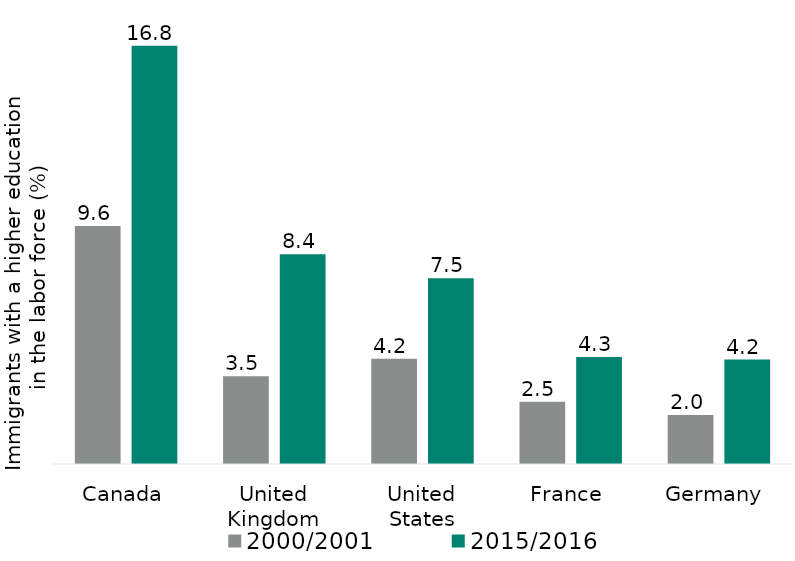
| Category | 2000/2001 | 2015/2016 |
|---|---|---|
| Canada | 9.563 | 16.808 |
| United Kingdom | 3.527 | 8.423 |
| United States | 4.234 | 7.461 |
| France | 2.506 | 4.301 |
| Germany | 1.971 | 4.196 |